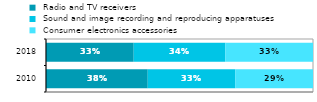
| Category |  Radio and TV receivers |  Sound and image recording and reproducing apparatuses |  Consumer electronics accessories |
|---|---|---|---|
| 2010 | 0.381 | 0.328 | 0.291 |
| 2018 | 0.329 | 0.343 | 0.329 |